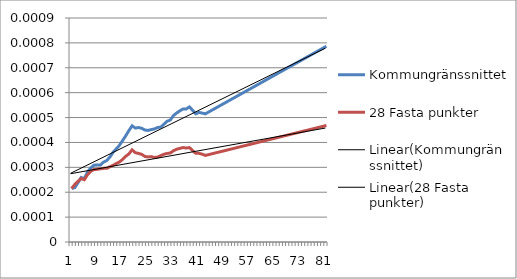
| Category | Kommungränssnittet | 28 Fasta punkter |
|---|---|---|
| 0 | 0 | 0 |
| 1 | 0 | 0 |
| 2 | 0 | 0 |
| 3 | 0 | 0 |
| 4 | 0 | 0 |
| 5 | 0 | 0 |
| 6 | 0 | 0 |
| 7 | 0 | 0 |
| 8 | 0 | 0 |
| 9 | 0 | 0 |
| 10 | 0 | 0 |
| 11 | 0 | 0 |
| 12 | 0 | 0 |
| 13 | 0 | 0 |
| 14 | 0 | 0 |
| 15 | 0 | 0 |
| 16 | 0 | 0 |
| 17 | 0 | 0 |
| 18 | 0 | 0 |
| 19 | 0 | 0 |
| 20 | 0 | 0 |
| 21 | 0 | 0 |
| 22 | 0 | 0 |
| 23 | 0 | 0 |
| 24 | 0 | 0 |
| 25 | 0 | 0 |
| 26 | 0 | 0 |
| 27 | 0 | 0 |
| 28 | 0 | 0 |
| 29 | 0 | 0 |
| 30 | 0 | 0 |
| 31 | 0 | 0 |
| 32 | 0.001 | 0 |
| 33 | 0.001 | 0 |
| 34 | 0.001 | 0 |
| 35 | 0.001 | 0 |
| 36 | 0.001 | 0 |
| 37 | 0.001 | 0 |
| 38 | 0.001 | 0 |
| 39 | 0.001 | 0 |
| 40 | 0.001 | 0 |
| 41 | 0.001 | 0 |
| 42 | 0.001 | 0 |
| 43 | 0.001 | 0 |
| 44 | 0.001 | 0 |
| 45 | 0.001 | 0 |
| 46 | 0.001 | 0 |
| 47 | 0.001 | 0 |
| 48 | 0.001 | 0 |
| 49 | 0.001 | 0 |
| 50 | 0.001 | 0 |
| 51 | 0.001 | 0 |
| 52 | 0.001 | 0 |
| 53 | 0.001 | 0 |
| 54 | 0.001 | 0 |
| 55 | 0.001 | 0 |
| 56 | 0.001 | 0 |
| 57 | 0.001 | 0 |
| 58 | 0.001 | 0 |
| 59 | 0.001 | 0 |
| 60 | 0.001 | 0 |
| 61 | 0.001 | 0 |
| 62 | 0.001 | 0 |
| 63 | 0.001 | 0 |
| 64 | 0.001 | 0 |
| 65 | 0.001 | 0 |
| 66 | 0.001 | 0 |
| 67 | 0.001 | 0 |
| 68 | 0.001 | 0 |
| 69 | 0.001 | 0 |
| 70 | 0.001 | 0 |
| 71 | 0.001 | 0 |
| 72 | 0.001 | 0 |
| 73 | 0.001 | 0 |
| 74 | 0.001 | 0 |
| 75 | 0.001 | 0 |
| 76 | 0.001 | 0 |
| 77 | 0.001 | 0 |
| 78 | 0.001 | 0 |
| 79 | 0.001 | 0 |
| 80 | 0.001 | 0 |